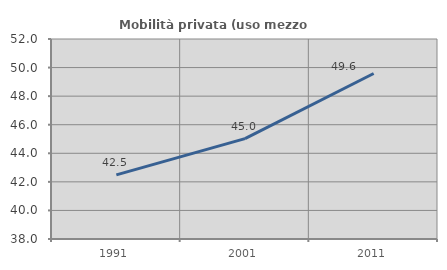
| Category | Mobilità privata (uso mezzo privato) |
|---|---|
| 1991.0 | 42.491 |
| 2001.0 | 45.025 |
| 2011.0 | 49.586 |